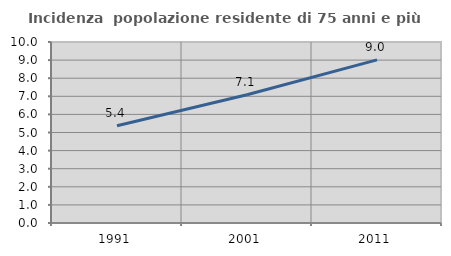
| Category | Incidenza  popolazione residente di 75 anni e più |
|---|---|
| 1991.0 | 5.373 |
| 2001.0 | 7.088 |
| 2011.0 | 9.014 |